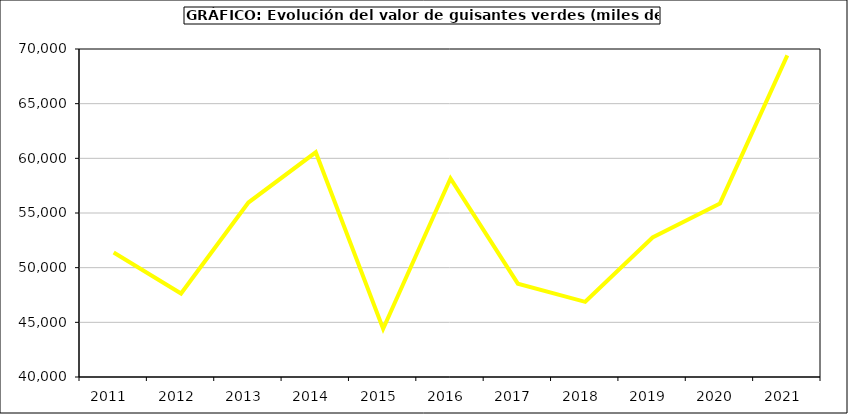
| Category | Valor |
|---|---|
| 2011.0 | 51384.72 |
| 2012.0 | 47635.04 |
| 2013.0 | 55957.374 |
| 2014.0 | 60552.887 |
| 2015.0 | 44411 |
| 2016.0 | 58153 |
| 2017.0 | 48537.691 |
| 2018.0 | 46876.83 |
| 2019.0 | 52761.852 |
| 2020.0 | 55876.725 |
| 2021.0 | 69416.881 |